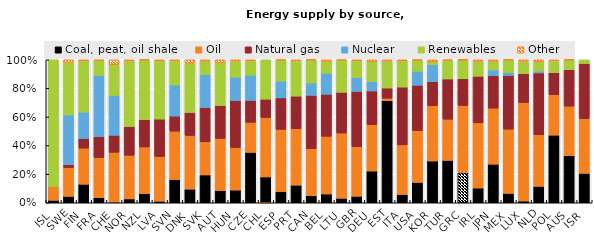
| Category | Coal, peat, oil shale | Oil | Natural gas | Nuclear | Renewables | Other |
|---|---|---|---|---|---|---|
| ISL | 0.017 | 0.096 | 0 | 0 | 0.887 | 0 |
| SWE | 0.045 | 0.201 | 0.02 | 0.348 | 0.368 | 0.018 |
| FIN | 0.13 | 0.252 | 0.068 | 0.184 | 0.357 | 0.009 |
| FRA | 0.036 | 0.279 | 0.146 | 0.429 | 0.103 | 0.006 |
| CHE | 0.003 | 0.35 | 0.119 | 0.279 | 0.214 | 0.035 |
| NOR | 0.027 | 0.305 | 0.201 | 0 | 0.458 | 0.009 |
| NZL | 0.064 | 0.326 | 0.191 | 0 | 0.417 | 0.001 |
| LVA | 0.01 | 0.313 | 0.262 | 0 | 0.407 | 0.007 |
| SVN | 0.162 | 0.338 | 0.106 | 0.218 | 0.167 | 0.009 |
| DNK | 0.095 | 0.375 | 0.161 | 0 | 0.343 | 0.025 |
| SVK | 0.195 | 0.232 | 0.24 | 0.231 | 0.091 | 0.012 |
| AUT | 0.085 | 0.365 | 0.229 | 0 | 0.301 | 0.019 |
| HUN | 0.089 | 0.298 | 0.328 | 0.164 | 0.111 | 0.01 |
| CZE | 0.353 | 0.21 | 0.153 | 0.176 | 0.1 | 0.008 |
| CHL | 0.181 | 0.415 | 0.128 | 0 | 0.276 | 0 |
| ESP | 0.079 | 0.435 | 0.22 | 0.118 | 0.147 | 0.002 |
| PRT | 0.123 | 0.395 | 0.228 | 0 | 0.244 | 0.01 |
| CAN | 0.049 | 0.329 | 0.374 | 0.086 | 0.162 | 0.001 |
| BEL | 0.061 | 0.403 | 0.294 | 0.147 | 0.081 | 0.013 |
| LTU | 0.031 | 0.456 | 0.285 | 0 | 0.225 | 0.003 |
| GBR | 0.046 | 0.346 | 0.387 | 0.097 | 0.116 | 0.008 |
| DEU | 0.222 | 0.324 | 0.236 | 0.065 | 0.139 | 0.013 |
| EST | 0.714 | 0.017 | 0.071 | 0 | 0.187 | 0.011 |
| ITA | 0.058 | 0.347 | 0.404 | 0 | 0.183 | 0.008 |
| USA | 0.142 | 0.362 | 0.317 | 0.099 | 0.078 | 0.002 |
| KOR | 0.292 | 0.387 | 0.167 | 0.12 | 0.019 | 0.014 |
| TUR | 0.296 | 0.288 | 0.282 | 0 | 0.131 | 0.003 |
| GRC | 0.21 | 0.471 | 0.186 | 0 | 0.133 | 0 |
| IRL | 0.103 | 0.456 | 0.326 | 0 | 0.103 | 0.012 |
| JPN | 0.27 | 0.392 | 0.227 | 0.04 | 0.059 | 0.012 |
| MEX | 0.066 | 0.449 | 0.375 | 0.019 | 0.09 | 0.001 |
| LUX | 0.012 | 0.688 | 0.202 | 0 | 0.086 | 0.011 |
| NLD | 0.115 | 0.361 | 0.433 | 0.013 | 0.065 | 0.014 |
| POL | 0.473 | 0.283 | 0.153 | 0 | 0.082 | 0.009 |
| AUS | 0.329 | 0.347 | 0.255 | 0 | 0.069 | 0.001 |
| ISR | 0.205 | 0.382 | 0.387 | 0 | 0.026 | 0 |